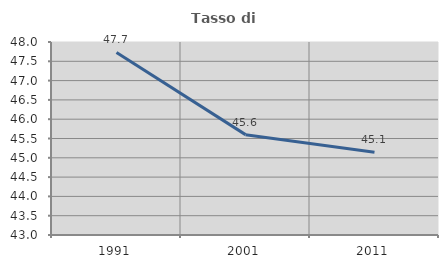
| Category | Tasso di occupazione   |
|---|---|
| 1991.0 | 47.728 |
| 2001.0 | 45.6 |
| 2011.0 | 45.144 |